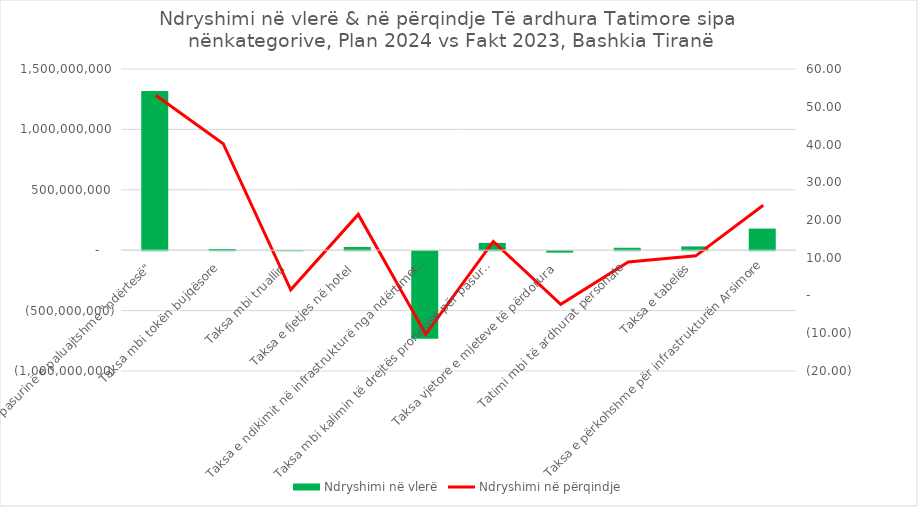
| Category | Ndryshimi në vlerë |
|---|---|
| Taksa mbi pasurinë e paluajtshme "ndërtesë" | 1317844092 |
| Taksa mbi tokën bujqësore | 9892937 |
| Taksa mbi truallin | 1337286 |
| Taksa e fjetjes në hotel | 26525787 |
| Taksa e ndikimit në infrastrukturë nga ndërtimet e reja | -725427117 |
| Taksa mbi kalimin të drejtës pronësisë për pasuritë e paluajtshme | 60178748 |
| Taksa vjetore e mjeteve të përdorura | -11719137 |
| Tatimi mbi të ardhurat personale | 20380050 |
| Taksa e tabelës | 31365040 |
| Taksa e përkohshme për infrastrukturën Arsimore | 178772867 |